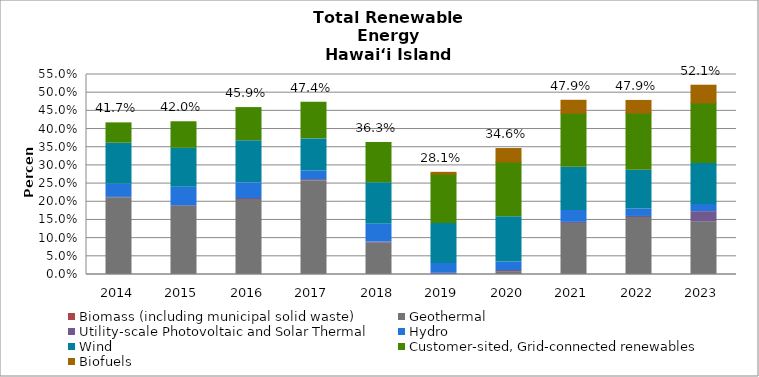
| Category | Biomass (including municipal solid waste) | Geothermal | Utility-scale Photovoltaic and Solar Thermal | Hydro | Wind | Customer-sited, Grid-connected renewables | Biofuels |
|---|---|---|---|---|---|---|---|
| 2014.0 | 0 | 0.211 | 0.001 | 0.036 | 0.113 | 0.056 | 0 |
| 2015.0 | 0 | 0.187 | 0.002 | 0.051 | 0.107 | 0.073 | 0 |
| 2016.0 | 0 | 0.206 | 0.003 | 0.043 | 0.116 | 0.091 | 0 |
| 2017.0 | 0 | 0.258 | 0.003 | 0.024 | 0.088 | 0.101 | 0 |
| 2018.0 | 0 | 0.086 | 0.003 | 0.049 | 0.115 | 0.11 | 0 |
| 2019.0 | 0 | 0 | 0.003 | 0.027 | 0.11 | 0.136 | 0.005 |
| 2020.0 | 0 | 0.008 | 0.003 | 0.023 | 0.124 | 0.151 | 0.037 |
| 2021.0 | 0 | 0.14 | 0.003 | 0.033 | 0.119 | 0.149 | 0.036 |
| 2022.0 | 0 | 0.157 | 0.003 | 0.021 | 0.106 | 0.158 | 0.035 |
| 2023.0 | 0 | 0.145 | 0.028 | 0.02 | 0.113 | 0.167 | 0.049 |